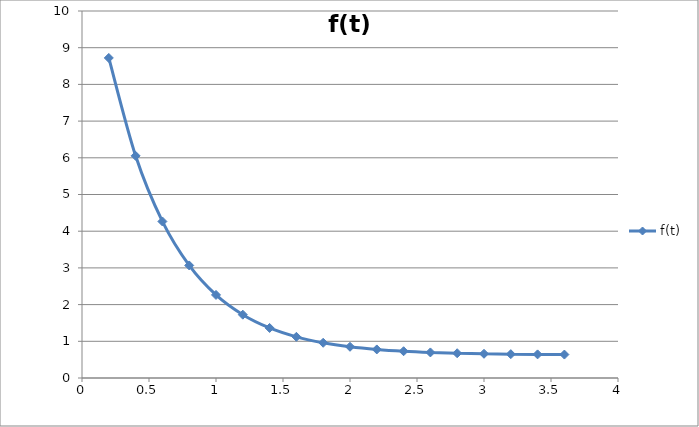
| Category | f(t) |
|---|---|
| 0.2 | 8.721 |
| 0.4 | 6.053 |
| 0.6 | 4.265 |
| 0.8 | 3.067 |
| 1.0 | 2.263 |
| 1.2 | 1.725 |
| 1.4 | 1.364 |
| 1.6 | 1.122 |
| 1.8 | 0.96 |
| 2.0 | 0.851 |
| 2.2 | 0.778 |
| 2.4 | 0.729 |
| 2.6 | 0.697 |
| 2.8 | 0.675 |
| 3.0 | 0.66 |
| 3.2 | 0.65 |
| 3.4 | 0.643 |
| 3.6 | 0.639 |